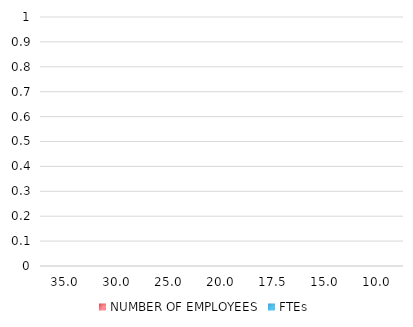
| Category | NUMBER OF EMPLOYEES | FTEs |
|---|---|---|
| 35.0 |  | 0 |
| 30.0 |  | 0 |
| 25.0 |  | 0 |
| 20.0 |  | 0 |
| 17.5 |  | 0 |
| 15.0 |  | 0 |
| 10.0 |  | 0 |